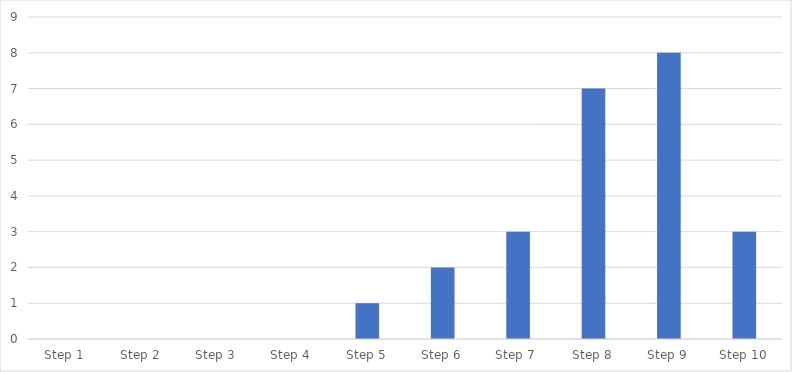
| Category | Number of Responses |
|---|---|
| Step 1 | 0 |
| Step 2 | 0 |
| Step 3 | 0 |
| Step 4 | 0 |
| Step 5 | 1 |
| Step 6 | 2 |
| Step 7  | 3 |
| Step 8 | 7 |
| Step 9 | 8 |
| Step 10 | 3 |